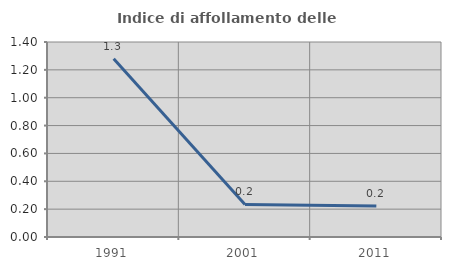
| Category | Indice di affollamento delle abitazioni  |
|---|---|
| 1991.0 | 1.28 |
| 2001.0 | 0.234 |
| 2011.0 | 0.222 |